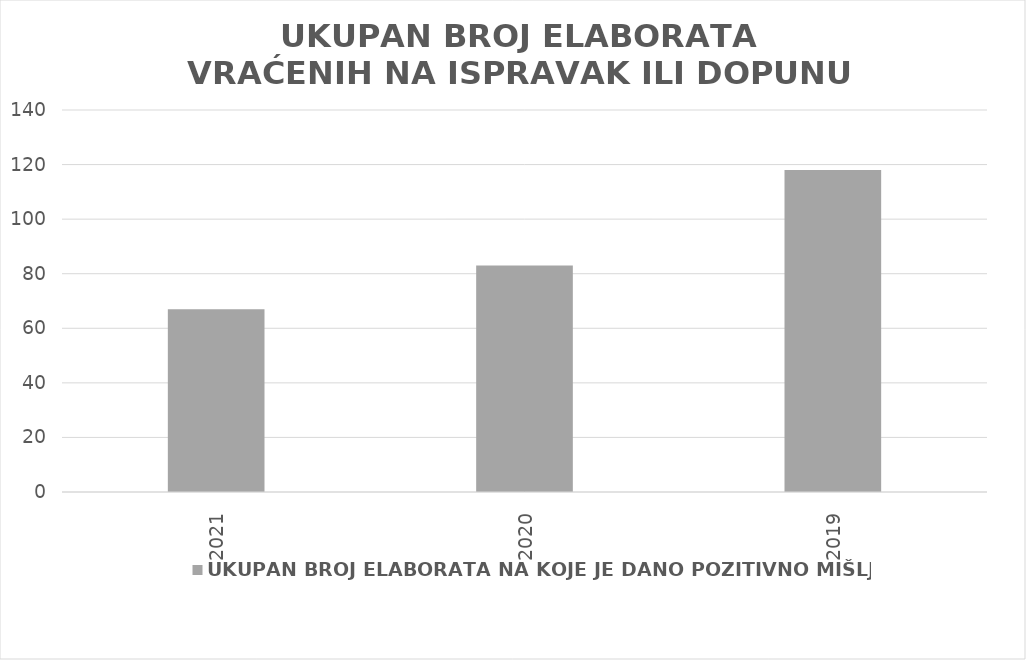
| Category | UKUPAN BROJ ELABORATA NA KOJE JE DANO POZITIVNO MIŠLJENJE |
|---|---|
| 2021.0 | 67 |
| 2020.0 | 83 |
| 2019.0 | 118 |